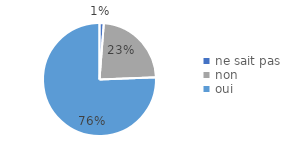
| Category | % |
|---|---|
| ne sait pas | 0.012 |
| non | 0.232 |
| oui | 0.756 |